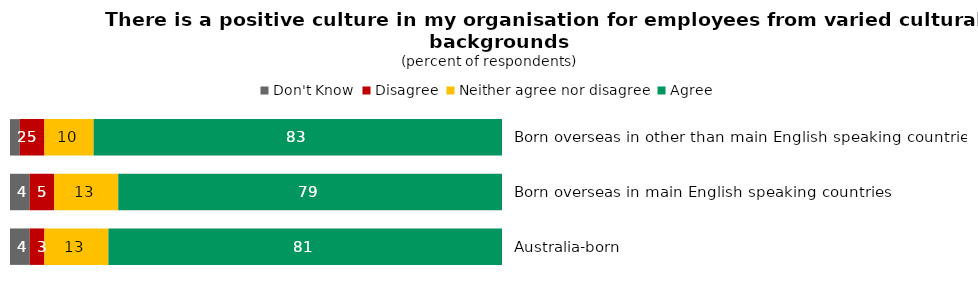
| Category | Don't Know | Disagree | Neither agree nor disagree | Agree |
|---|---|---|---|---|
| Born overseas in other than main English speaking countries | 2 | 5 | 10 | 83 |
| Born overseas in main English speaking countries | 4 | 5 | 13 | 79 |
| Australia-born | 4 | 3 | 13 | 81 |